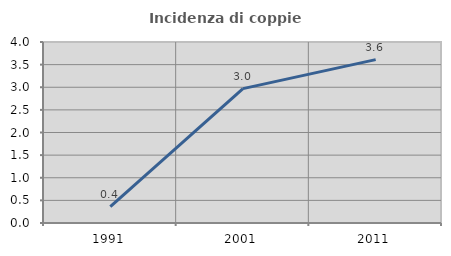
| Category | Incidenza di coppie miste |
|---|---|
| 1991.0 | 0.36 |
| 2001.0 | 2.97 |
| 2011.0 | 3.61 |